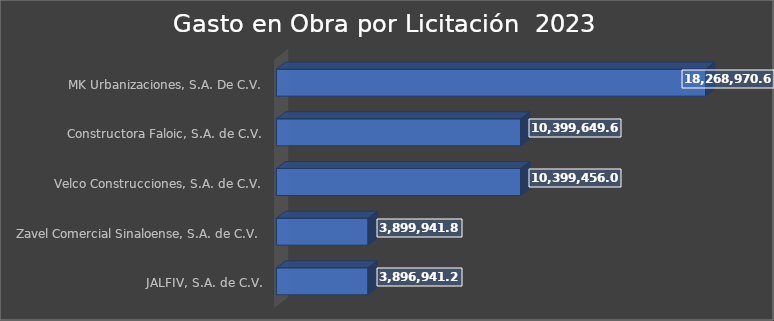
| Category | Suma |
|---|---|
| JALFIV, S.A. de C.V. | 3896941.2 |
| Zavel Comercial Sinaloense, S.A. de C.V. | 3899941.8 |
| Velco Construcciones, S.A. de C.V. | 10399456 |
| Constructora Faloic, S.A. de C.V. | 10399649.6 |
| MK Urbanizaciones, S.A. De C.V. | 18268970.68 |